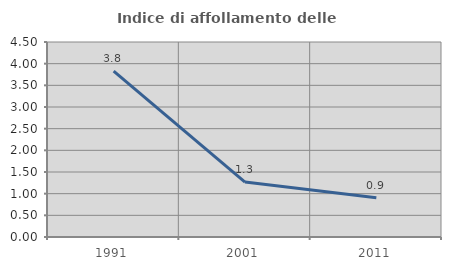
| Category | Indice di affollamento delle abitazioni  |
|---|---|
| 1991.0 | 3.828 |
| 2001.0 | 1.267 |
| 2011.0 | 0.905 |